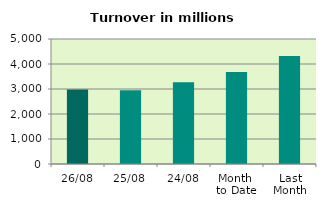
| Category | Series 0 |
|---|---|
| 26/08 | 2980.674 |
| 25/08 | 2952.868 |
| 24/08 | 3270.584 |
| Month 
to Date | 3675.711 |
| Last
Month | 4319.965 |